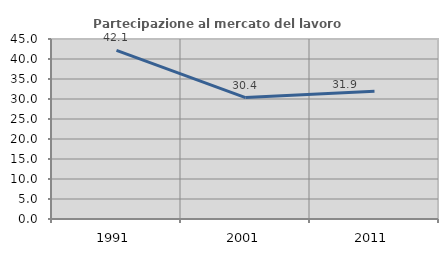
| Category | Partecipazione al mercato del lavoro  femminile |
|---|---|
| 1991.0 | 42.146 |
| 2001.0 | 30.355 |
| 2011.0 | 31.935 |